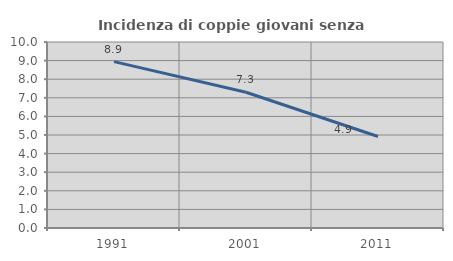
| Category | Incidenza di coppie giovani senza figli |
|---|---|
| 1991.0 | 8.946 |
| 2001.0 | 7.3 |
| 2011.0 | 4.918 |